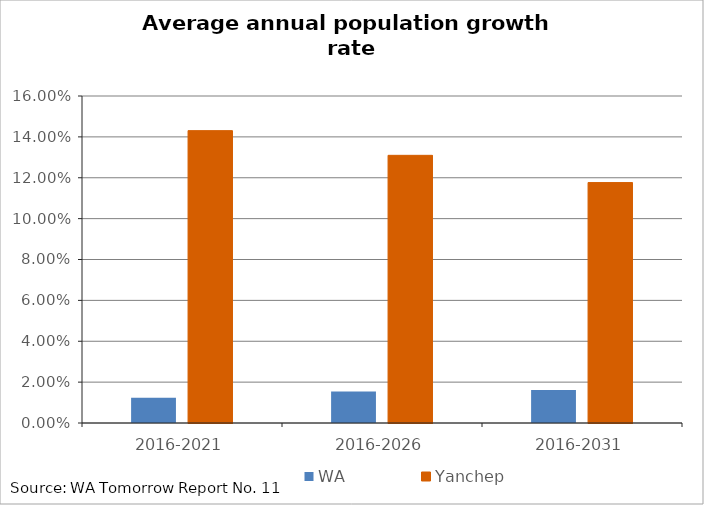
| Category | WA | Yanchep |
|---|---|---|
| 2016-2021 | 0.012 | 0.143 |
| 2016-2026 | 0.015 | 0.131 |
| 2016-2031 | 0.016 | 0.118 |